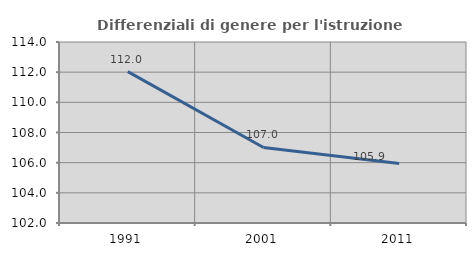
| Category | Differenziali di genere per l'istruzione superiore |
|---|---|
| 1991.0 | 112.036 |
| 2001.0 | 107.008 |
| 2011.0 | 105.94 |